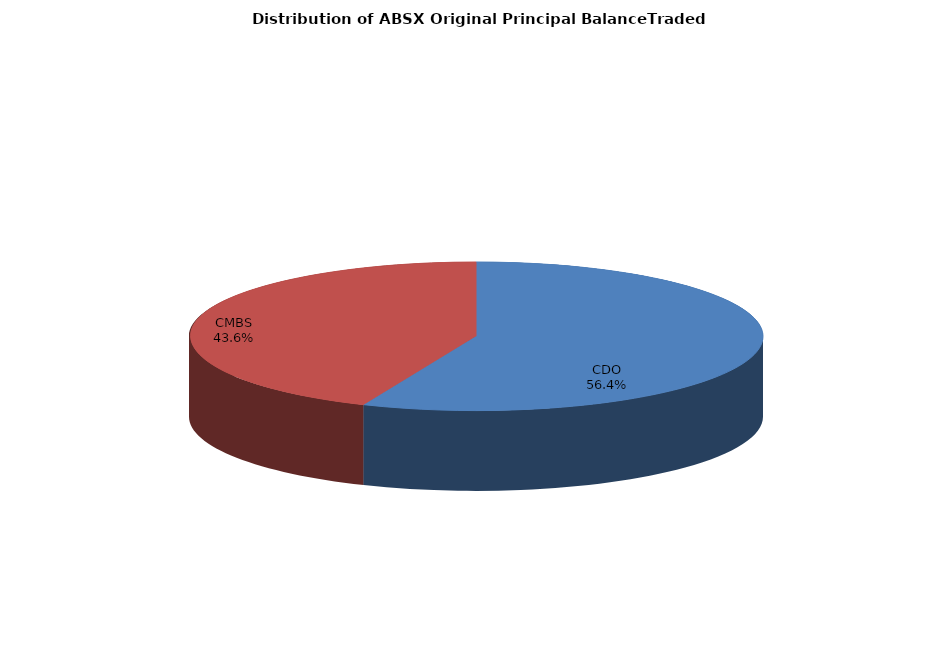
| Category | Series 0 |
|---|---|
| CDO | 2811235841.848 |
| CMBS | 2173178024.516 |